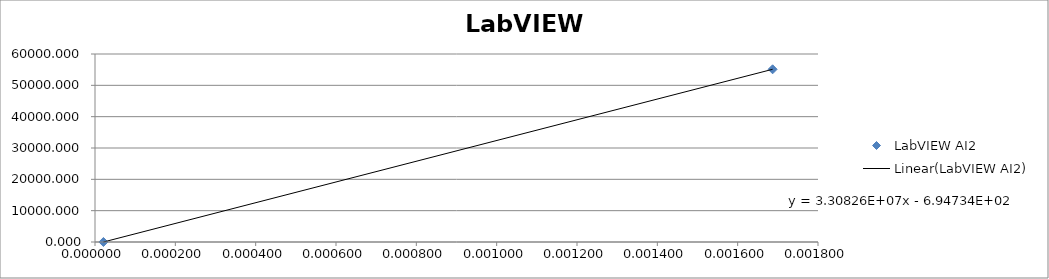
| Category | LabVIEW AI2 |
|---|---|
| 2.1e-05 | 0 |
| nan | 11023.113 |
| nan | 22046.226 |
| nan | 33069.339 |
| nan | 44092.452 |
| 0.001687 | 55115.566 |